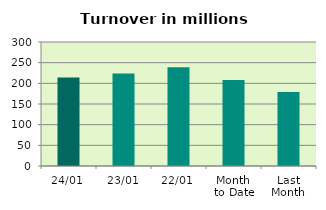
| Category | Series 0 |
|---|---|
| 24/01 | 213.89 |
| 23/01 | 223.965 |
| 22/01 | 239.14 |
| Month 
to Date | 207.93 |
| Last
Month | 179.047 |